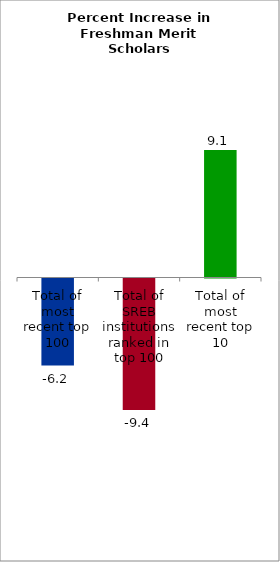
| Category | Series 0 |
|---|---|
| Total of most recent top 100 | -6.205 |
| Total of SREB institutions ranked in top 100 | -9.364 |
| Total of most recent top 10 | 9.082 |